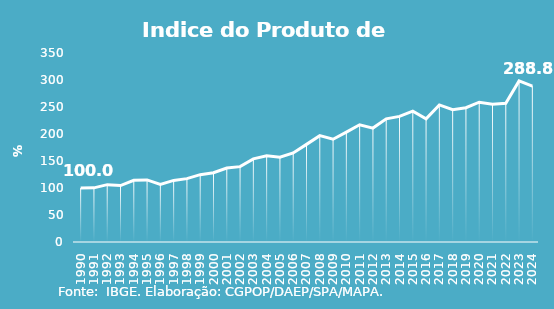
| Category | Indice de Prod. base 1990 |
|---|---|
| 1990.0 | 100 |
| 1991.0 | 100.275 |
| 1992.0 | 106.203 |
| 1993.0 | 104.57 |
| 1994.0 | 114.164 |
| 1995.0 | 115.024 |
| 1996.0 | 106.552 |
| 1997.0 | 114.037 |
| 1998.0 | 117.319 |
| 1999.0 | 124.734 |
| 2000.0 | 128.293 |
| 2001.0 | 136.975 |
| 2002.0 | 139.51 |
| 2003.0 | 153.868 |
| 2004.0 | 159.641 |
| 2005.0 | 157.136 |
| 2006.0 | 164.858 |
| 2007.0 | 180.781 |
| 2008.0 | 196.91 |
| 2009.0 | 190.309 |
| 2010.0 | 203.581 |
| 2011.0 | 217.041 |
| 2012.0 | 210.932 |
| 2013.0 | 228.009 |
| 2014.0 | 232.562 |
| 2015.0 | 242.318 |
| 2016.0 | 228.239 |
| 2017.0 | 253.826 |
| 2018.0 | 245.134 |
| 2019.0 | 248.619 |
| 2020.0 | 258.848 |
| 2021.0 | 254.988 |
| 2022.0 | 256.904 |
| 2023.0 | 298.269 |
| 2024.0 | 288.808 |